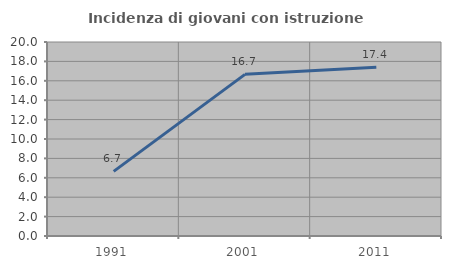
| Category | Incidenza di giovani con istruzione universitaria |
|---|---|
| 1991.0 | 6.667 |
| 2001.0 | 16.667 |
| 2011.0 | 17.391 |